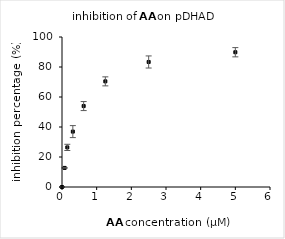
| Category | Series 0 |
|---|---|
| 5.0 | 89.85 |
| 2.5 | 83.35 |
| 1.25 | 70.43 |
| 0.625 | 53.96 |
| 0.3125 | 36.93 |
| 0.153125 | 26.4 |
| 0.076 | 12.72 |
| 0.0 | 0 |